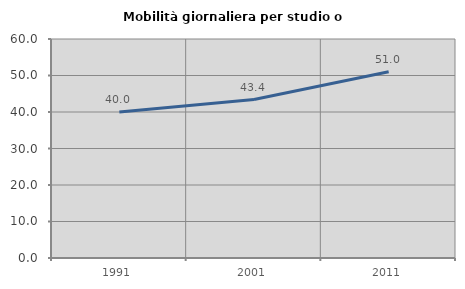
| Category | Mobilità giornaliera per studio o lavoro |
|---|---|
| 1991.0 | 40.027 |
| 2001.0 | 43.402 |
| 2011.0 | 51.021 |